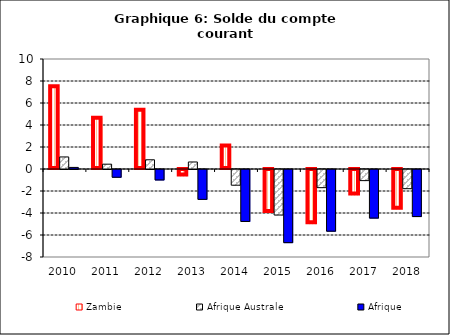
| Category | Zambie | Afrique Australe | Afrique |
|---|---|---|---|
| 2010.0 | 7.527 | 1.095 | 0.144 |
| 2011.0 | 4.658 | 0.439 | -0.706 |
| 2012.0 | 5.382 | 0.839 | -0.95 |
| 2013.0 | -0.59 | 0.638 | -2.715 |
| 2014.0 | 2.139 | -1.429 | -4.722 |
| 2015.0 | -3.909 | -4.138 | -6.65 |
| 2016.0 | -4.929 | -1.65 | -5.608 |
| 2017.0 | -2.322 | -1.011 | -4.418 |
| 2018.0 | -3.603 | -1.744 | -4.278 |